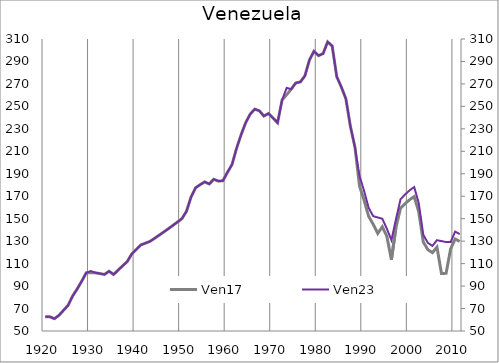
| Category | Ven17 |
|---|---|
| 1920.0 | 62.667 |
| 1921.0 | 62.667 |
| 1922.0 | 60.961 |
| 1923.0 | 63.935 |
| 1924.0 | 68.415 |
| 1925.0 | 72.764 |
| 1926.0 | 81.11 |
| 1927.0 | 87.402 |
| 1928.0 | 94.331 |
| 1929.0 | 101.81 |
| 1930.0 | 101.832 |
| 1931.0 | 101.853 |
| 1932.0 | 101.115 |
| 1933.0 | 100.377 |
| 1934.0 | 103.214 |
| 1935.0 | 100.318 |
| 1936.0 | 104.255 |
| 1937.0 | 108.03 |
| 1938.0 | 111.863 |
| 1939.0 | 118.667 |
| 1940.0 | 122.631 |
| 1941.0 | 126.654 |
| 1942.0 | 128.228 |
| 1943.0 | 129.82 |
| 1944.0 | 132.531 |
| 1945.0 | 135.299 |
| 1946.0 | 138.125 |
| 1947.0 | 141.009 |
| 1948.0 | 143.954 |
| 1949.0 | 146.961 |
| 1950.0 | 150.03 |
| 1951.0 | 156.565 |
| 1952.0 | 169.191 |
| 1953.0 | 177.494 |
| 1954.0 | 180.28 |
| 1955.0 | 182.773 |
| 1956.0 | 180.934 |
| 1957.0 | 185.099 |
| 1958.0 | 183.449 |
| 1959.0 | 183.808 |
| 1960.0 | 191.266 |
| 1961.0 | 198.166 |
| 1962.0 | 212.651 |
| 1963.0 | 224.809 |
| 1964.0 | 235.452 |
| 1965.0 | 243.147 |
| 1966.0 | 247.555 |
| 1967.0 | 246.078 |
| 1968.0 | 241.42 |
| 1969.0 | 243.66 |
| 1970.0 | 239.646 |
| 1971.0 | 235.432 |
| 1972.0 | 255.743 |
| 1973.0 | 260.377 |
| 1974.0 | 265.365 |
| 1975.0 | 270.841 |
| 1976.0 | 271.756 |
| 1977.0 | 277.15 |
| 1978.0 | 291.259 |
| 1979.0 | 299.146 |
| 1980.0 | 295.187 |
| 1981.0 | 297.02 |
| 1982.0 | 307.424 |
| 1983.0 | 303.744 |
| 1984.0 | 276.413 |
| 1985.0 | 267.297 |
| 1986.0 | 256.82 |
| 1987.0 | 232.222 |
| 1988.0 | 213.494 |
| 1989.0 | 179.091 |
| 1990.0 | 166.472 |
| 1991.0 | 152.156 |
| 1992.0 | 144.998 |
| 1993.0 | 136.84 |
| 1994.0 | 142.833 |
| 1995.0 | 134.343 |
| 1996.0 | 113.368 |
| 1997.0 | 142.334 |
| 1998.0 | 159.272 |
| 1999.0 | 163.423 |
| 2000.0 | 166.89 |
| 2001.0 | 169.681 |
| 2002.0 | 156.172 |
| 2003.0 | 129.27 |
| 2004.0 | 122.403 |
| 2005.0 | 119.763 |
| 2006.0 | 124.643 |
| 2007.0 | 101.175 |
| 2008.0 | 101.353 |
| 2009.0 | 123.049 |
| 2010.0 | 131.932 |
| 2011.0 | 129.781 |